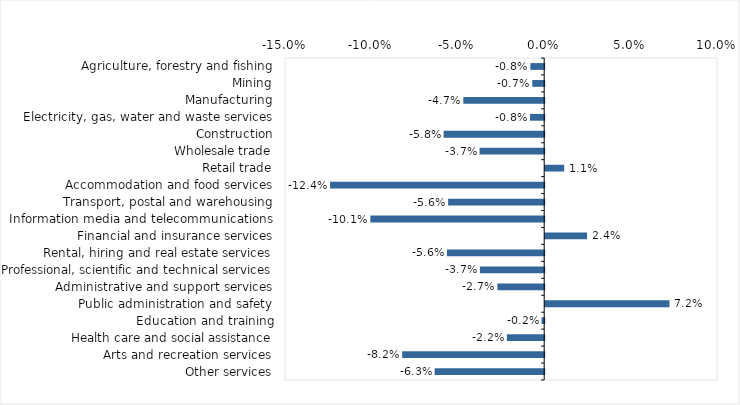
| Category | This week |
|---|---|
| Agriculture, forestry and fishing | -0.008 |
| Mining | -0.007 |
| Manufacturing | -0.047 |
| Electricity, gas, water and waste services | -0.008 |
| Construction | -0.058 |
| Wholesale trade | -0.037 |
| Retail trade | 0.011 |
| Accommodation and food services | -0.124 |
| Transport, postal and warehousing | -0.056 |
| Information media and telecommunications | -0.101 |
| Financial and insurance services | 0.024 |
| Rental, hiring and real estate services | -0.056 |
| Professional, scientific and technical services | -0.037 |
| Administrative and support services | -0.027 |
| Public administration and safety | 0.072 |
| Education and training | -0.002 |
| Health care and social assistance | -0.022 |
| Arts and recreation services | -0.082 |
| Other services | -0.063 |